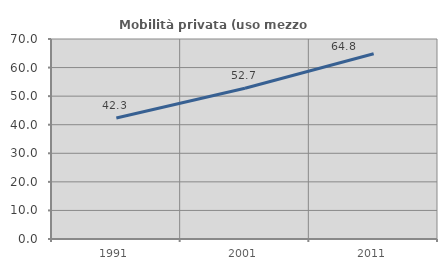
| Category | Mobilità privata (uso mezzo privato) |
|---|---|
| 1991.0 | 42.338 |
| 2001.0 | 52.747 |
| 2011.0 | 64.824 |